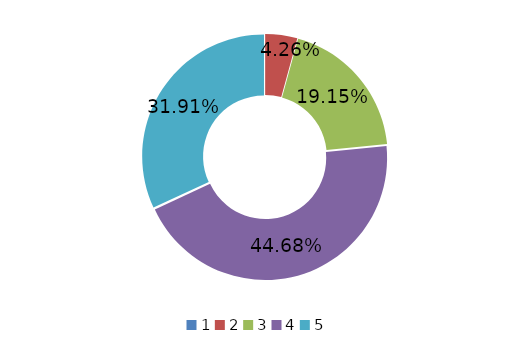
| Category | Series 1 |
|---|---|
| 0 | 0 |
| 1 | 0.043 |
| 2 | 0.191 |
| 3 | 0.447 |
| 4 | 0.319 |